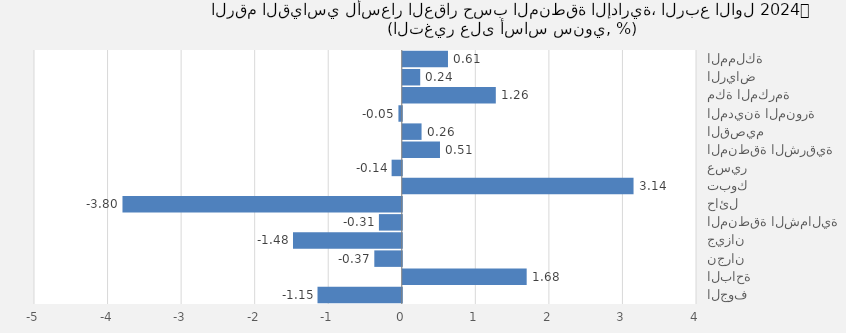
| Category | 2024 |
|---|---|
| المملكة | 0.615 |
| الرياض | 0.237 |
| مكة المكرمة | 1.265 |
| المدينة المنورة | -0.046 |
| القصيم | 0.255 |
| المنطقة الشرقية | 0.506 |
| عسير | -0.138 |
| تبوك | 3.137 |
| حائل | -3.797 |
| المنطقة الشمالية | -0.311 |
| جيزان | -1.479 |
| نجران | -0.373 |
| الباحة | 1.685 |
| الجوف | -1.146 |